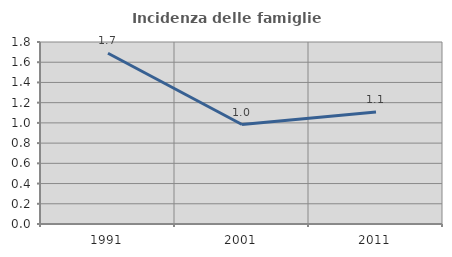
| Category | Incidenza delle famiglie numerose |
|---|---|
| 1991.0 | 1.688 |
| 2001.0 | 0.984 |
| 2011.0 | 1.108 |